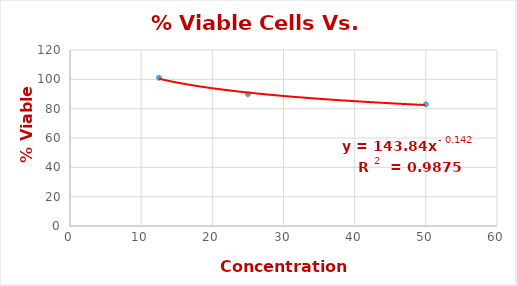
| Category | Series 0 |
|---|---|
| 50.0 | 82.977 |
| 25.0 | 89.833 |
| 12.5 | 101.068 |